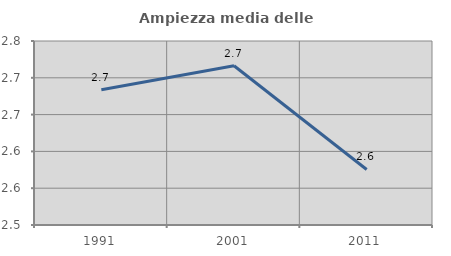
| Category | Ampiezza media delle famiglie |
|---|---|
| 1991.0 | 2.684 |
| 2001.0 | 2.716 |
| 2011.0 | 2.575 |